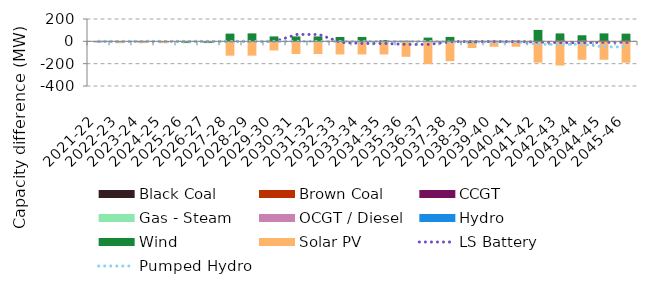
| Category | Black Coal | Brown Coal | CCGT | Gas - Steam | OCGT / Diesel | Hydro | Wind | Solar PV |
|---|---|---|---|---|---|---|---|---|
| 2021-22 | 0 | 0 | 0 | 0 | 0.002 | 0 | 0 | 0.004 |
| 2022-23 | 0 | 0 | 0.001 | 0 | 0.002 | 0 | 0.013 | -7.889 |
| 2023-24 | 0 | 0 | 0.001 | 0 | 0.002 | 0 | 0.015 | -7.889 |
| 2024-25 | 0 | 0 | 0.001 | 0 | 0.002 | 0 | -0.088 | -7.889 |
| 2025-26 | 0 | 0 | 0.001 | 0 | 0.002 | 0 | -6.652 | 2.991 |
| 2026-27 | 0 | 0 | 0.001 | 0 | 0.002 | 0 | -6.585 | 2.996 |
| 2027-28 | 0 | 0 | 0.001 | 0 | 0.002 | 0 | 69.175 | -119.477 |
| 2028-29 | 0 | 0 | 0.001 | 0 | 0.003 | 0 | 71.3 | -119.477 |
| 2029-30 | 0 | 0 | 0.001 | 0 | 0.003 | 0 | 44.047 | -72.46 |
| 2030-31 | 0 | 0 | 0.001 | 0 | 0.003 | 0 | 44.052 | -104.341 |
| 2031-32 | 0 | 0 | 0.001 | 0 | 0.003 | 0 | 44.052 | -104.339 |
| 2032-33 | 0 | 0 | 0.002 | 0 | 0.003 | 0 | 39.174 | -108.644 |
| 2033-34 | 0 | 0 | 0.002 | 0 | 0.003 | 0 | 39.178 | -108.644 |
| 2034-35 | 0 | 0 | 0.002 | 0 | 0.003 | 0 | 11.198 | -108.644 |
| 2035-36 | 0 | 0 | 0.003 | 0 | 0.002 | 0 | 4.23 | -129.56 |
| 2036-37 | 0 | 0 | 0.003 | 0 | 0.002 | 0 | 33.306 | -195.295 |
| 2037-38 | 0 | 0 | 0.586 | 0 | 5.661 | 0 | 33.391 | -168.797 |
| 2038-39 | 0 | 0 | 0.587 | 0 | 5.661 | 0 | -15.428 | -35.273 |
| 2039-40 | 0 | 0 | 0.587 | 0 | 5.662 | 0 | -4.357 | -35.273 |
| 2040-41 | 0 | 0 | 0.587 | 0 | 5.662 | 0 | -4.357 | -35.271 |
| 2041-42 | 0 | 0 | 0.587 | 0 | 5.662 | 0 | 96.136 | -182.115 |
| 2042-43 | 0 | 0 | 10.018 | 0 | 5.662 | 0 | 55.295 | -207.578 |
| 2043-44 | 0 | 0 | 10.018 | 0 | 5.662 | 0 | 38.773 | -156.105 |
| 2044-45 | 0 | 0 | 10.019 | 0 | 3.772 | 0 | 57.346 | -156.104 |
| 2045-46 | 0 | 0 | 10.019 | 0 | 3.772 | 0 | 55.091 | -182.189 |